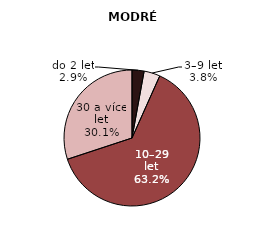
| Category | modré odrůdy |
|---|---|
| do 2 let | 146.088 |
| 3–9 let | 195.987 |
| 10–29 let | 3233.074 |
| 30 a více let | 1536.893 |